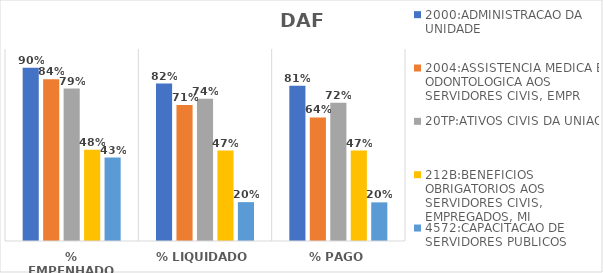
| Category | 2000:ADMINISTRACAO DA UNIDADE | 2004:ASSISTENCIA MEDICA E ODONTOLOGICA AOS SERVIDORES CIVIS, EMPR | 20TP:ATIVOS CIVIS DA UNIAO | 212B:BENEFICIOS OBRIGATORIOS AOS SERVIDORES CIVIS, EMPREGADOS, MI | 4572:CAPACITACAO DE SERVIDORES PUBLICOS FEDERAIS EM PROCESSO DE Q |
|---|---|---|---|---|---|
| % EMPENHADO | 0.903 | 0.843 | 0.794 | 0.476 | 0.435 |
| % LIQUIDADO | 0.82 | 0.708 | 0.741 | 0.471 | 0.202 |
| % PAGO | 0.809 | 0.643 | 0.72 | 0.471 | 0.201 |